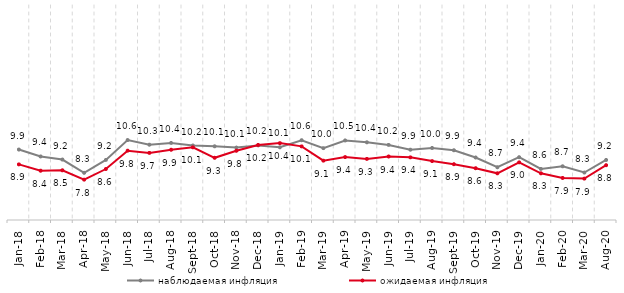
| Category | наблюдаемая инфляция | ожидаемая инфляция |
|---|---|---|
| 2018-01-01 | 9.916 | 8.879 |
| 2018-02-01 | 9.433 | 8.44 |
| 2018-03-01 | 9.218 | 8.469 |
| 2018-04-01 | 8.292 | 7.814 |
| 2018-05-01 | 9.192 | 8.556 |
| 2018-06-01 | 10.578 | 9.837 |
| 2018-07-01 | 10.255 | 9.682 |
| 2018-08-01 | 10.378 | 9.901 |
| 2018-09-01 | 10.196 | 10.07 |
| 2018-10-01 | 10.143 | 9.339 |
| 2018-11-01 | 10.053 | 9.831 |
| 2018-12-01 | 10.205 | 10.236 |
| 2019-01-01 | 10.071 | 10.363 |
| 2019-02-01 | 10.567 | 10.136 |
| 2019-03-01 | 10.013 | 9.141 |
| 2019-04-01 | 10.548 | 9.39 |
| 2019-05-01 | 10.421 | 9.264 |
| 2019-06-01 | 10.239 | 9.429 |
| 2019-07-01 | 9.904 | 9.371 |
| 2019-08-01 | 10.027 | 9.11 |
| 2019-09-01 | 9.867 | 8.894 |
| 2019-10-01 | 9.362 | 8.612 |
| 2019-11-01 | 8.68 | 8.257 |
| 2019-12-01 | 9.383 | 9.022 |
| 2020-01-01 | 8.566 | 8.259 |
| 2020-02-01 | 8.747 | 7.934 |
| 2020-03-01 | 8.311 | 7.888 |
| 2020-08-01 | 9.19 | 8.823 |